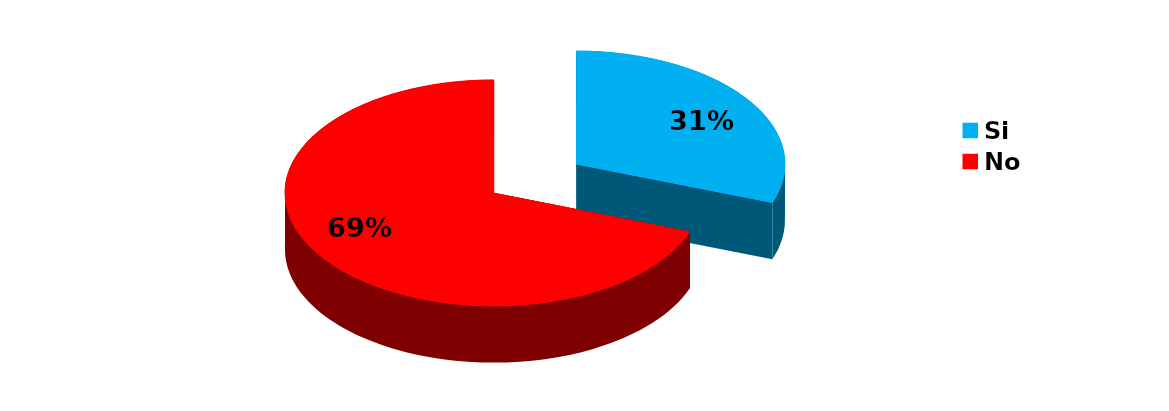
| Category | Series 0 |
|---|---|
| Si | 102 |
| No | 232 |